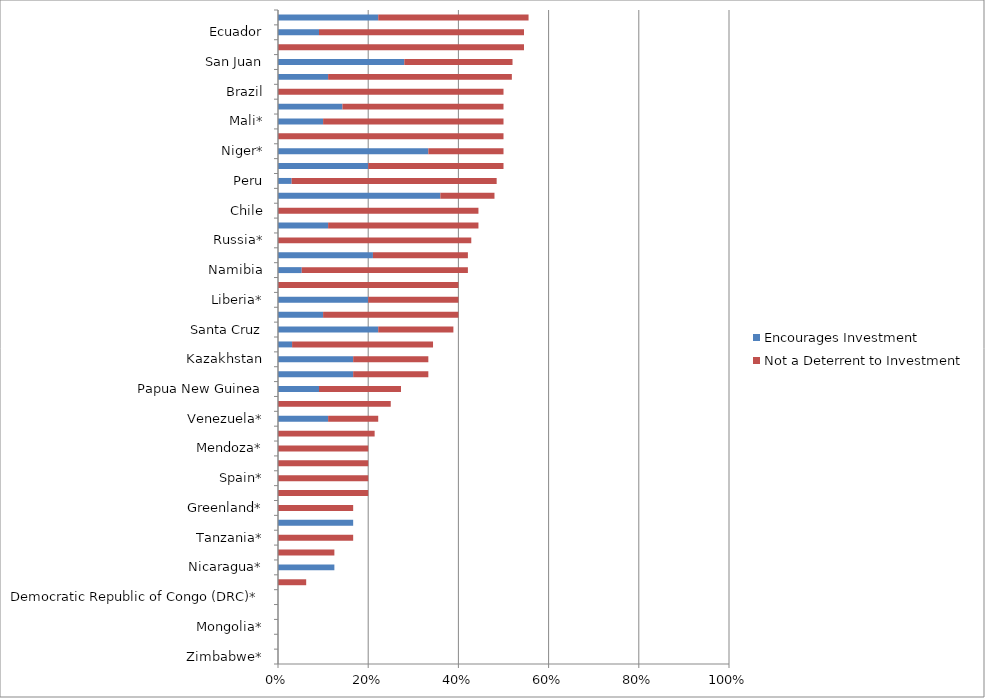
| Category | Encourages Investment | Not a Deterrent to Investment |
|---|---|---|
| Zimbabwe* | 0 | 0 |
| Philippines* | 0 | 0 |
| Mongolia* | 0 | 0 |
| Kyrgyzstan* | 0 | 0 |
| Democratic Republic of Congo (DRC)* | 0 | 0 |
| Bolivia | 0 | 0.062 |
| Nicaragua* | 0.125 | 0 |
| China* | 0 | 0.125 |
| Tanzania* | 0 | 0.167 |
| Guyana* | 0.167 | 0 |
| Greenland* | 0 | 0.167 |
| Turkey | 0 | 0.2 |
| Spain* | 0 | 0.2 |
| New Zealand* | 0 | 0.2 |
| Mendoza* | 0 | 0.2 |
| Chubut | 0 | 0.214 |
| Venezuela* | 0.111 | 0.111 |
| Indonesia | 0 | 0.25 |
| Papua New Guinea | 0.091 | 0.182 |
| Panama* | 0.167 | 0.167 |
| Kazakhstan | 0.167 | 0.167 |
| Mexico | 0.031 | 0.312 |
| Santa Cruz | 0.222 | 0.167 |
| Norway | 0.1 | 0.3 |
| Liberia* | 0.2 | 0.2 |
| California | 0 | 0.4 |
| Namibia | 0.053 | 0.368 |
| Jujuy | 0.211 | 0.211 |
| Russia* | 0 | 0.429 |
| South Africa | 0.111 | 0.333 |
| Chile | 0 | 0.444 |
| Salta | 0.36 | 0.12 |
| Peru | 0.03 | 0.455 |
| Rio Negro* | 0.2 | 0.3 |
| Niger* | 0.333 | 0.167 |
| Minnesota* | 0 | 0.5 |
| Mali* | 0.1 | 0.4 |
| Colombia | 0.143 | 0.357 |
| Brazil | 0 | 0.5 |
| Manitoba | 0.111 | 0.407 |
| San Juan | 0.28 | 0.24 |
| Ghana | 0 | 0.545 |
| Ecuador | 0.091 | 0.455 |
| La Rioja | 0.222 | 0.333 |